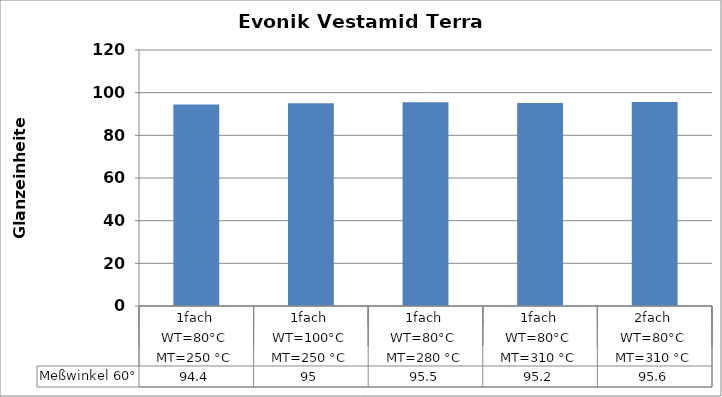
| Category | Meßwinkel 60° |
|---|---|
| 0 | 94.4 |
| 1 | 95 |
| 2 | 95.5 |
| 3 | 95.2 |
| 4 | 95.6 |